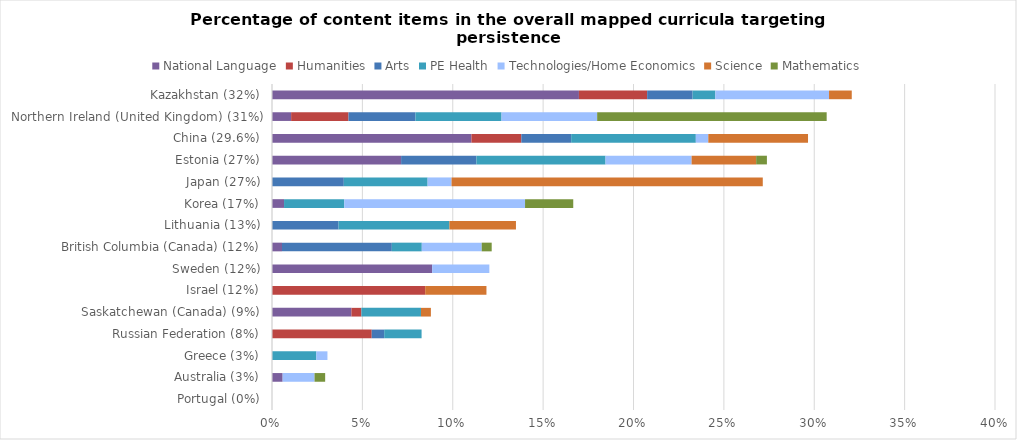
| Category | National Language | Humanities | Arts | PE Health | Technologies/Home Economics | Science | Mathematics |
|---|---|---|---|---|---|---|---|
| Portugal (0%) | 0 | 0 | 0 | 0 | 0 | 0 | 0 |
| Australia (3%) | 0.006 | 0 | 0 | 0 | 0.018 | 0 | 0.006 |
| Greece (3%) | 0 | 0 | 0 | 0.025 | 0.006 | 0 | 0 |
| Russian Federation (8%) | 0 | 0.055 | 0.007 | 0.021 | 0 | 0 | 0 |
| Saskatchewan (Canada) (9%) | 0.044 | 0.005 | 0 | 0.033 | 0 | 0.005 | 0 |
| Israel (12%) | 0 | 0.085 | 0 | 0 | 0 | 0.034 | 0 |
| Sweden (12%) | 0.089 | 0 | 0 | 0 | 0.032 | 0 | 0 |
| British Columbia (Canada) (12%) | 0.006 | 0 | 0.061 | 0.017 | 0.033 | 0 | 0.006 |
| Lithuania (13%) | 0 | 0 | 0.037 | 0.061 | 0 | 0.037 | 0 |
| Korea (17%) | 0.007 | 0 | 0 | 0.033 | 0.1 | 0 | 0.027 |
| Japan (27%) | 0 | 0 | 0.04 | 0.046 | 0.013 | 0.172 | 0 |
| Estonia (27%) | 0.071 | 0 | 0.042 | 0.071 | 0.048 | 0.036 | 0.006 |
| China (29.6%) | 0.11 | 0.028 | 0.028 | 0.069 | 0.007 | 0.055 | 0 |
| Northern Ireland (United Kingdom) (31%) | 0.011 | 0.032 | 0.037 | 0.048 | 0.053 | 0 | 0.127 |
| Kazakhstan (32%) | 0.17 | 0.038 | 0.025 | 0.013 | 0.063 | 0.013 | 0 |